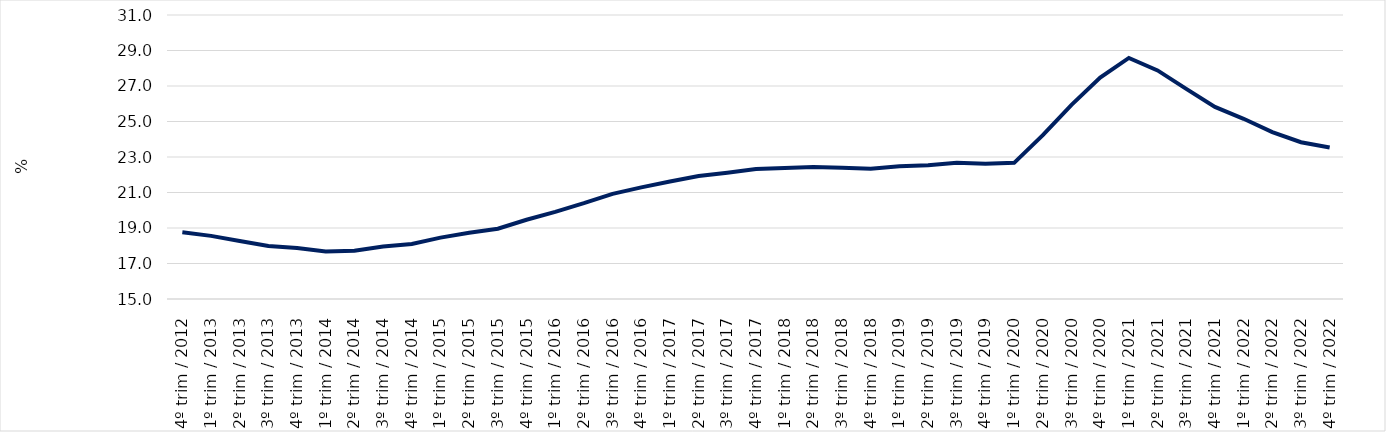
| Category | Series 0 |
|---|---|
| 4º trim / 2012 | 18.759 |
| 1º trim / 2013 | 18.556 |
| 2º trim / 2013 | 18.272 |
| 3º trim / 2013 | 17.983 |
| 4º trim / 2013 | 17.873 |
| 1º trim / 2014 | 17.68 |
| 2º trim / 2014 | 17.713 |
| 3º trim / 2014 | 17.952 |
| 4º trim / 2014 | 18.099 |
| 1º trim / 2015 | 18.458 |
| 2º trim / 2015 | 18.732 |
| 3º trim / 2015 | 18.961 |
| 4º trim / 2015 | 19.464 |
| 1º trim / 2016 | 19.912 |
| 2º trim / 2016 | 20.399 |
| 3º trim / 2016 | 20.925 |
| 4º trim / 2016 | 21.289 |
| 1º trim / 2017 | 21.622 |
| 2º trim / 2017 | 21.931 |
| 3º trim / 2017 | 22.114 |
| 4º trim / 2017 | 22.318 |
| 1º trim / 2018 | 22.377 |
| 2º trim / 2018 | 22.432 |
| 3º trim / 2018 | 22.397 |
| 4º trim / 2018 | 22.342 |
| 1º trim / 2019 | 22.475 |
| 2º trim / 2019 | 22.542 |
| 3º trim / 2019 | 22.672 |
| 4º trim / 2019 | 22.616 |
| 1º trim / 2020 | 22.671 |
| 2º trim / 2020 | 24.228 |
| 3º trim / 2020 | 25.94 |
| 4º trim / 2020 | 27.473 |
| 1º trim / 2021 | 28.579 |
| 2º trim / 2021 | 27.879 |
| 3º trim / 2021 | 26.838 |
| 4º trim / 2021 | 25.819 |
| 1º trim / 2022 | 25.152 |
| 2º trim / 2022 | 24.404 |
| 3º trim / 2022 | 23.833 |
| 4º trim / 2022 | 23.539 |